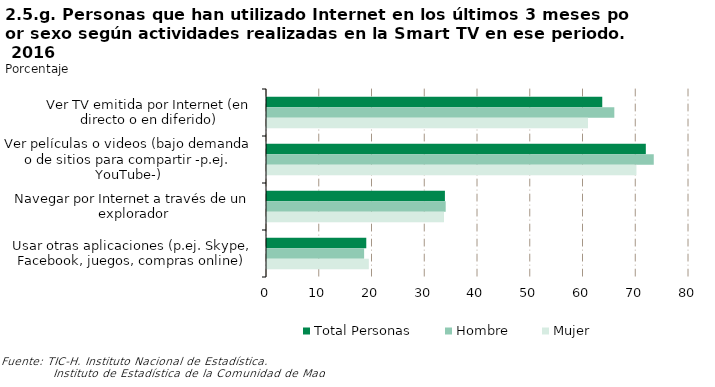
| Category | Total Personas | Hombre | Mujer |
|---|---|---|---|
| Ver TV emitida por Internet (en directo o en diferido) | 63.555 | 65.843 | 60.858 |
| Ver películas o videos (bajo demanda o de sitios para compartir -p.ej. YouTube-) | 71.815 | 73.322 | 70.038 |
| Navegar por Internet a través de un explorador | 33.728 | 33.878 | 33.551 |
| Usar otras aplicaciones (p.ej. Skype, Facebook, juegos, compras online) | 18.821 | 18.412 | 19.303 |